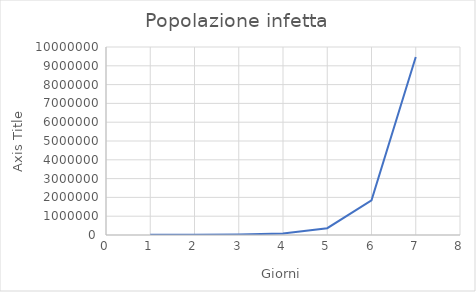
| Category | Series 0 |
|---|---|
| 1.0 | 15544 |
| 2.0 | 17427 |
| 3.0 | 27425 |
| 4.0 | 80485.91 |
| 5.0 | 361839.066 |
| 6.0 | 1846153.37 |
| 7.0 | 9466772.554 |